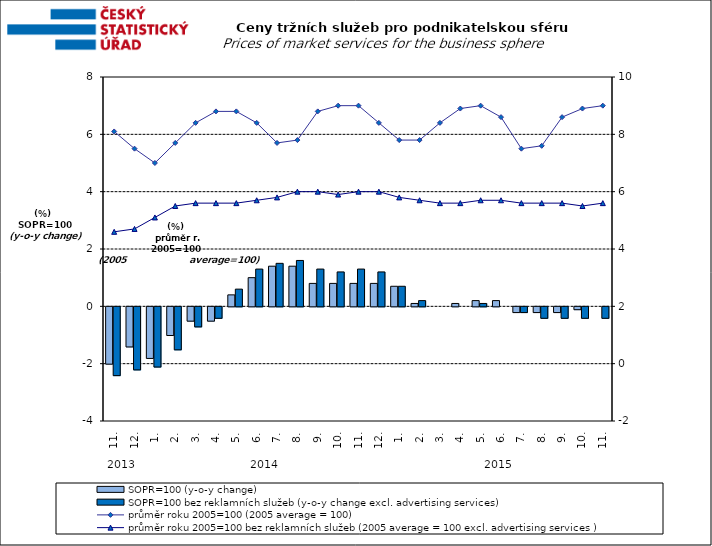
| Category | SOPR=100 (y-o-y change)   | SOPR=100 bez reklamních služeb (y-o-y change excl. advertising services)   |
|---|---|---|
| 0 | -2 | -2.4 |
| 1 | -1.4 | -2.2 |
| 2 | -1.8 | -2.1 |
| 3 | -1 | -1.5 |
| 4 | -0.5 | -0.7 |
| 5 | -0.5 | -0.4 |
| 6 | 0.4 | 0.6 |
| 7 | 1 | 1.3 |
| 8 | 1.4 | 1.5 |
| 9 | 1.4 | 1.6 |
| 10 | 0.8 | 1.3 |
| 11 | 0.8 | 1.2 |
| 12 | 0.8 | 1.3 |
| 13 | 0.8 | 1.2 |
| 14 | 0.7 | 0.7 |
| 15 | 0.1 | 0.2 |
| 16 | 0 | 0 |
| 17 | 0.1 | 0 |
| 18 | 0.2 | 0.1 |
| 19 | 0.2 | 0 |
| 20 | -0.2 | -0.2 |
| 21 | -0.2 | -0.4 |
| 22 | -0.2 | -0.4 |
| 23 | -0.1 | -0.4 |
| 24 | 0 | -0.4 |